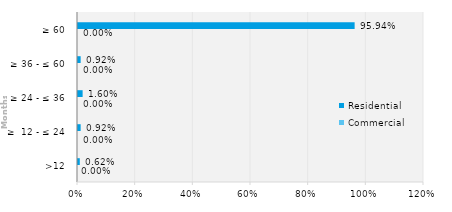
| Category | Commercial | Residential |
|---|---|---|
| >12 | 0 | 0.006 |
| ≥  12 - ≤ 24 | 0 | 0.009 |
| ≥ 24 - ≤ 36 | 0 | 0.016 |
| ≥ 36 - ≤ 60 | 0 | 0.009 |
| ≥ 60 | 0 | 0.959 |